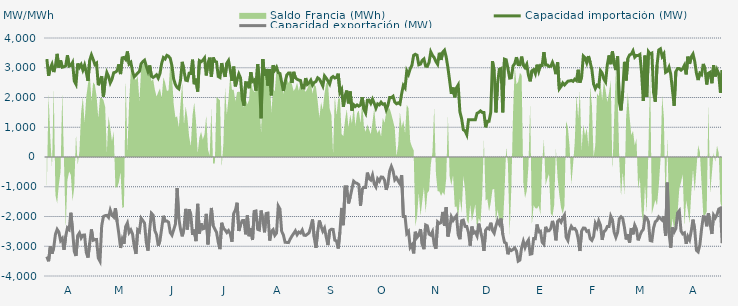
| Category | Capacidad importación (MW) | Capacidad exportación (MW) |
|---|---|---|
| 0 | 3292.833 | -3348.958 |
| 1900-01-01 | 2730.667 | -3504.917 |
| 1900-01-02 | 2985 | -3005.417 |
| 1900-01-03 | 3117.458 | -3250.417 |
| 1900-01-04 | 2855.083 | -3052.042 |
| 1900-01-05 | 3069.458 | -2602.292 |
| 1900-01-06 | 3466.417 | -2432.792 |
| 1900-01-07 | 3007.167 | -2522.875 |
| 1900-01-08 | 3244.375 | -2811.167 |
| 1900-01-09 | 3017.708 | -2737.208 |
| 1900-01-10 | 3032.833 | -3121.625 |
| 1900-01-11 | 3065.708 | -2665.083 |
| 1900-01-12 | 3418.292 | -2382.667 |
| 1900-01-13 | 3056.792 | -2438.792 |
| 1900-01-14 | 3079.167 | -1874.583 |
| 1900-01-15 | 3179.375 | -2471.917 |
| 1900-01-16 | 2552.25 | -3173.583 |
| 1900-01-17 | 2444.667 | -3327.792 |
| 1900-01-18 | 3144.958 | -2640.625 |
| 1900-01-19 | 3010.208 | -2550.208 |
| 1900-01-20 | 3107.125 | -2722.583 |
| 1900-01-21 | 2923.625 | -2627.417 |
| 1900-01-22 | 3090.583 | -2621.917 |
| 1900-01-23 | 2846.083 | -3210.25 |
| 1900-01-24 | 2560.75 | -3379.792 |
| 1900-01-25 | 3251.25 | -2896.042 |
| 1900-01-26 | 3432.333 | -2434.75 |
| 1900-01-27 | 3283.375 | -2799.542 |
| 1900-01-28 | 3108.792 | -2777.042 |
| 1900-01-29 | 3154.917 | -2772.25 |
| 1900-01-30 | 2413.25 | -3395.792 |
| 1900-01-31 | 2576 | -3503 |
| 1900-02-01 | 2711.917 | -2310.333 |
| 1900-02-02 | 2031.25 | -2002.083 |
| 1900-02-03 | 2544.667 | -1970.833 |
| 1900-02-04 | 2838.208 | -1962.5 |
| 1900-02-05 | 2706.708 | -2031.25 |
| 1900-02-06 | 2490.375 | -1785.417 |
| 1900-02-07 | 2612.792 | -1947.333 |
| 1900-02-08 | 2833 | -2014.333 |
| 1900-02-09 | 2851.583 | -1722.917 |
| 1900-02-10 | 2901.75 | -2171.25 |
| 1900-02-11 | 3113.667 | -2582.042 |
| 1900-02-12 | 2787.083 | -3055.958 |
| 1900-02-13 | 3331.625 | -2767.125 |
| 1900-02-14 | 3347 | -2920.625 |
| 1900-02-15 | 3277.833 | -2334.375 |
| 1900-02-16 | 3547.333 | -2216.875 |
| 1900-02-17 | 3127.583 | -2536.667 |
| 1900-02-18 | 3182.75 | -2450.958 |
| 1900-02-19 | 2868.792 | -2589.917 |
| 1900-02-20 | 2696.25 | -3016.542 |
| 1900-02-21 | 2758.458 | -3256.458 |
| 1900-02-22 | 2820.083 | -2452.083 |
| 1900-02-23 | 2874.792 | -2511.083 |
| 1900-02-24 | 3131.542 | -2059.125 |
| 1900-02-25 | 3205.375 | -2136.25 |
| 1900-02-26 | 3253.375 | -2224.125 |
| 1900-02-27 | 3057.042 | -2870.958 |
| 1900-02-28 | 2876.042 | -3146.333 |
| 1900-02-28 | 3076.708 | -2437.5 |
| 1900-03-01 | 2714.417 | -1890.667 |
| 1900-03-02 | 2675.25 | -1952.042 |
| 1900-03-03 | 2712.625 | -2473.333 |
| 1900-03-04 | 2762.542 | -2608.917 |
| 1900-03-05 | 2652 | -2984.583 |
| 1900-03-06 | 2806.792 | -2803.333 |
| 1900-03-07 | 3151.167 | -2401.458 |
| 1900-03-08 | 3341.792 | -1976.417 |
| 1900-03-09 | 3295.083 | -2154.25 |
| 1900-03-10 | 3415.542 | -2148.458 |
| 1900-03-11 | 3386.458 | -2191.625 |
| 1900-03-12 | 3315.833 | -2538.333 |
| 1900-03-13 | 3059.75 | -2627.417 |
| 1900-03-14 | 2619.042 | -2445.958 |
| 1900-03-15 | 2434.542 | -2258.708 |
| 1900-03-16 | 2336.958 | -1043.75 |
| 1900-03-17 | 2291.5 | -2066.667 |
| 1900-03-18 | 2591.375 | -2432.417 |
| 1900-03-19 | 3198.167 | -2666.208 |
| 1900-03-20 | 2894.833 | -2404.875 |
| 1900-03-21 | 2582.208 | -1743.542 |
| 1900-03-22 | 2566.333 | -2434.875 |
| 1900-03-23 | 2811.458 | -1757.708 |
| 1900-03-24 | 2808 | -1938.167 |
| 1900-03-25 | 3272.083 | -2618.542 |
| 1900-03-26 | 2447.208 | -2437.333 |
| 1900-03-27 | 2633.208 | -2826.667 |
| 1900-03-28 | 2202.083 | -1575 |
| 1900-03-29 | 3237.583 | -2574.625 |
| 1900-03-30 | 3201.042 | -2230.542 |
| 1900-03-31 | 3248.625 | -2416.417 |
| 1900-04-01 | 3327.583 | -2395.083 |
| 1900-04-02 | 2740.958 | -1910.417 |
| 1900-04-03 | 3160.083 | -2937.917 |
| 1900-04-04 | 3339 | -2237.833 |
| 1900-04-05 | 2697.208 | -1712.5 |
| 1900-04-06 | 3342.917 | -2305.083 |
| 1900-04-07 | 3218 | -2421.583 |
| 1900-04-08 | 3194.333 | -2530.333 |
| 1900-04-09 | 2706.458 | -2869.083 |
| 1900-04-10 | 2673 | -3096.5 |
| 1900-04-11 | 3156.5 | -2212.083 |
| 1900-04-12 | 2884.958 | -2401.708 |
| 1900-04-13 | 2692.292 | -2450.833 |
| 1900-04-14 | 3152.125 | -2539.5 |
| 1900-04-15 | 3244.042 | -2473.208 |
| 1900-04-16 | 2930.458 | -2581.292 |
| 1900-04-17 | 2559.833 | -2848.708 |
| 1900-04-18 | 3037.583 | -1901.417 |
| 1900-04-19 | 2375 | -1787.5 |
| 1900-04-20 | 2608.75 | -1537.5 |
| 1900-04-21 | 2790.667 | -2487.458 |
| 1900-04-22 | 2656.542 | -2277.167 |
| 1900-04-23 | 1950.833 | -2138.208 |
| 1900-04-24 | 1725 | -2133.333 |
| 1900-04-25 | 2500 | -2600 |
| 1900-04-26 | 2493.5 | -1964.583 |
| 1900-04-27 | 2311.125 | -2662.542 |
| 1900-04-28 | 2848.5 | -2386.333 |
| 1900-04-29 | 2541.5 | -2790.625 |
| 1900-04-30 | 2586.083 | -1829.542 |
| 1900-05-01 | 2229.167 | -1813.75 |
| 1900-05-02 | 3118.458 | -2430.875 |
| 1900-05-03 | 2560.5 | -2453.333 |
| 1900-05-04 | 1300 | -1800 |
| 1900-05-05 | 3293.208 | -2107.333 |
| 1900-05-06 | 2732.333 | -2531.667 |
| 1900-05-07 | 2958.208 | -1899.667 |
| 1900-05-08 | 2400 | -1885.417 |
| 1900-05-09 | 2949.792 | -2809.042 |
| 1900-05-10 | 2072.292 | -2500 |
| 1900-05-11 | 3083.958 | -2440.167 |
| 1900-05-12 | 2921.208 | -2632.667 |
| 1900-05-13 | 3017.667 | -2556.542 |
| 1900-05-14 | 2833.833 | -1646.083 |
| 1900-05-15 | 2807.833 | -1750 |
| 1900-05-16 | 2510.417 | -2496.792 |
| 1900-05-17 | 2220.833 | -2618.625 |
| 1900-05-18 | 2512.5 | -2867.042 |
| 1900-05-19 | 2756.375 | -2870.75 |
| 1900-05-20 | 2821.542 | -2876.667 |
| 1900-05-21 | 2821.833 | -2755.625 |
| 1900-05-22 | 2490.292 | -2656.833 |
| 1900-05-23 | 2862.667 | -2571.458 |
| 1900-05-24 | 2663.042 | -2482.25 |
| 1900-05-25 | 2613.625 | -2612.792 |
| 1900-05-26 | 2585.667 | -2523.458 |
| 1900-05-27 | 2571.292 | -2556.167 |
| 1900-05-28 | 2320.458 | -2456.542 |
| 1900-05-29 | 2316.542 | -2627.667 |
| 1900-05-30 | 2652.5 | -2635.708 |
| 1900-05-31 | 2442.625 | -2594.208 |
| 1900-06-01 | 2493.458 | -2546.125 |
| 1900-06-02 | 2582.917 | -2351.208 |
| 1900-06-03 | 2416.667 | -2100 |
| 1900-06-04 | 2504.5 | -2703.167 |
| 1900-06-05 | 2536.625 | -3052.25 |
| 1900-06-06 | 2662.208 | -2510.833 |
| 1900-06-07 | 2620.667 | -2134.75 |
| 1900-06-08 | 2511.833 | -2330.583 |
| 1900-06-09 | 2387.333 | -2494.25 |
| 1900-06-10 | 2724.583 | -2389 |
| 1900-06-11 | 2648.667 | -2691.542 |
| 1900-06-12 | 2557.292 | -2961.542 |
| 1900-06-13 | 2454.083 | -2472.25 |
| 1900-06-14 | 2661.417 | -2427.292 |
| 1900-06-15 | 2704.833 | -2434.167 |
| 1900-06-16 | 2653.75 | -2795.833 |
| 1900-06-17 | 2673.75 | -2822.875 |
| 1900-06-18 | 2800.917 | -3075.208 |
| 1900-06-19 | 2164.417 | -2510.625 |
| 1900-06-20 | 2270.833 | -1713.542 |
| 1900-06-21 | 1687.5 | -2291.667 |
| 1900-06-22 | 2066.667 | -1000 |
| 1900-06-23 | 2233.333 | -1000 |
| 1900-06-24 | 1804.167 | -1561.333 |
| 1900-06-25 | 2201.833 | -1341.667 |
| 1900-06-26 | 1556.25 | -1070.833 |
| 1900-06-27 | 1756.25 | -812.5 |
| 1900-06-28 | 1700 | -864.583 |
| 1900-06-29 | 1750 | -885.417 |
| 1900-06-30 | 1708.333 | -929.167 |
| 1900-07-01 | 1743.75 | -1636.25 |
| 1900-07-02 | 2008.083 | -1077.083 |
| 1900-07-03 | 1602.083 | -1020.833 |
| 1900-07-04 | 1479.167 | -1022.917 |
| 1900-07-05 | 1910.417 | -525 |
| 1900-07-06 | 1912.5 | -727.083 |
| 1900-07-07 | 1804.167 | -775 |
| 1900-07-08 | 1945.833 | -608.333 |
| 1900-07-09 | 1808.333 | -904.167 |
| 1900-07-10 | 1641.667 | -1006.25 |
| 1900-07-11 | 1785.417 | -735.417 |
| 1900-07-12 | 1752.083 | -812.5 |
| 1900-07-13 | 1841.667 | -675 |
| 1900-07-14 | 1772.917 | -677.083 |
| 1900-07-15 | 1788 | -777.083 |
| 1900-07-16 | 1587.5 | -1104.167 |
| 1900-07-17 | 1737.5 | -900 |
| 1900-07-18 | 1997.917 | -475 |
| 1900-07-19 | 1995.833 | -316.667 |
| 1900-07-20 | 2041.667 | -468.75 |
| 1900-07-21 | 1843.75 | -766.667 |
| 1900-07-22 | 1787.5 | -695.833 |
| 1900-07-23 | 1820.833 | -808.333 |
| 1900-07-24 | 1781.25 | -900 |
| 1900-07-25 | 2126.667 | -608.333 |
| 1900-07-26 | 2404.417 | -2000 |
| 1900-07-27 | 2323.167 | -2000 |
| 1900-07-28 | 2893.583 | -2571.5 |
| 1900-07-29 | 2778.083 | -2500.25 |
| 1900-07-30 | 2965.5 | -3038.667 |
| 1900-07-31 | 3083.64 | -2955.48 |
| 1900-08-01 | 3418.208 | -3238.958 |
| 1900-08-02 | 3452.875 | -2513.333 |
| 1900-08-03 | 3420.292 | -2703.208 |
| 1900-08-04 | 3100.083 | -2630.333 |
| 1900-08-05 | 3123.375 | -2422.458 |
| 1900-08-06 | 3242.792 | -2928.833 |
| 1900-08-07 | 3294.958 | -3098.417 |
| 1900-08-08 | 3054.042 | -2285.333 |
| 1900-08-09 | 3047.542 | -2315.25 |
| 1900-08-10 | 3179.458 | -2592.333 |
| 1900-08-11 | 3533.833 | -2627.792 |
| 1900-08-12 | 3414 | -2509.75 |
| 1900-08-13 | 3340.25 | -2944.208 |
| 1900-08-14 | 3208.208 | -3084.875 |
| 1900-08-15 | 3116.333 | -2180.292 |
| 1900-08-16 | 3502.875 | -2231.333 |
| 1900-08-17 | 3262.542 | -2201.667 |
| 1900-08-18 | 3524.167 | -1845.708 |
| 1900-08-19 | 3589.042 | -2314 |
| 1900-08-20 | 3358.375 | -1684.042 |
| 1900-08-21 | 3002 | -2672.375 |
| 1900-08-22 | 2567.583 | -2409.375 |
| 1900-08-23 | 2121 | -2013.417 |
| 1900-08-24 | 2334.5 | -2132.333 |
| 1900-08-25 | 2006.833 | -2047.042 |
| 1900-08-26 | 2325 | -1968.542 |
| 1900-08-27 | 2420.75 | -2611.292 |
| 1900-08-28 | 1517.25 | -2763 |
| 1900-08-29 | 1283.917 | -2141.667 |
| 1900-08-30 | 916.417 | -2120.833 |
| 1900-08-31 | 879.167 | -2332.417 |
| 1900-09-01 | 750 | -2334.958 |
| 1900-09-02 | 1250 | -2536 |
| 1900-09-03 | 1250 | -2982 |
| 1900-09-04 | 1250 | -2338.583 |
| 1900-09-05 | 1250 | -2558.333 |
| 1900-09-06 | 1250 | -2526.375 |
| 1900-09-07 | 1470.833 | -2652.25 |
| 1900-09-08 | 1500 | -2239.292 |
| 1900-09-09 | 1550 | -2486.75 |
| 1900-09-10 | 1500 | -2733.5 |
| 1900-09-11 | 1500 | -3155.125 |
| 1900-09-12 | 1000 | -2458.542 |
| 1900-09-13 | 1200 | -2385.25 |
| 1900-09-14 | 1200 | -2419 |
| 1900-09-15 | 1500 | -2208.75 |
| 1900-09-16 | 3221.708 | -2468.625 |
| 1900-09-17 | 2881.375 | -2561.25 |
| 1900-09-18 | 1500 | -2320.833 |
| 1900-09-19 | 2479.75 | -2136.875 |
| 1900-09-20 | 2947.875 | -2253.917 |
| 1900-09-21 | 2974.833 | -2068.75 |
| 1900-09-22 | 1500 | -2595.083 |
| 1900-09-23 | 3289.208 | -2867.583 |
| 1900-09-24 | 3267.875 | -2898.625 |
| 1900-09-25 | 2979.083 | -3270.083 |
| 1900-09-26 | 2652.375 | -3097.333 |
| 1900-09-27 | 2663.208 | -3144.542 |
| 1900-09-28 | 3058.292 | -3107.917 |
| 1900-09-29 | 3141.958 | -3054.292 |
| 1900-09-30 | 3354.667 | -3163.833 |
| 1900-10-01 | 3106.083 | -3500.875 |
| 1900-10-02 | 3099.042 | -3464.417 |
| 1900-10-03 | 3374.208 | -3046.25 |
| 1900-10-04 | 3081.083 | -2836.417 |
| 1900-10-05 | 3002 | -3040.417 |
| 1900-10-06 | 3113.875 | -2884.417 |
| 1900-10-07 | 2746.792 | -2789.333 |
| 1900-10-08 | 2544 | -3266.167 |
| 1900-10-09 | 2896.458 | -3250.667 |
| 1900-10-10 | 2937 | -2740.375 |
| 1900-10-11 | 2803.458 | -2745 |
| 1900-10-12 | 3104.125 | -2267.833 |
| 1900-10-13 | 2884.333 | -2514.583 |
| 1900-10-14 | 3081.042 | -2493.458 |
| 1900-10-15 | 3079.083 | -2866 |
| 1900-10-16 | 3524.292 | -2932.083 |
| 1900-10-17 | 3096.5 | -2347.083 |
| 1900-10-18 | 3096.5 | -2484.875 |
| 1900-10-19 | 3044.417 | -2478.583 |
| 1900-10-20 | 3048.167 | -2403.5 |
| 1900-10-21 | 3181.083 | -2147.542 |
| 1900-10-22 | 3030.708 | -2365.833 |
| 1900-10-23 | 2784.5 | -2801.333 |
| 1900-10-24 | 3182.417 | -2165.083 |
| 1900-10-25 | 2292.583 | -2110.5 |
| 1900-10-26 | 2370.25 | -2192.75 |
| 1900-10-27 | 2487.208 | -2051.417 |
| 1900-10-28 | 2421.292 | -1952.083 |
| 1900-10-29 | 2482.917 | -2699.375 |
| 1900-10-30 | 2548.458 | -2805.375 |
| 1900-10-31 | 2554.458 | -2484.042 |
| 1900-11-01 | 2574.083 | -2331.417 |
| 1900-11-02 | 2544.458 | -2417.833 |
| 1900-11-03 | 2615.833 | -2403.25 |
| 1900-11-04 | 2568.917 | -2488.625 |
| 1900-11-05 | 2932.208 | -2748.875 |
| 1900-11-06 | 2500.875 | -3160.125 |
| 1900-11-07 | 2689.458 | -2491.667 |
| 1900-11-08 | 3392.292 | -2386.5 |
| 1900-11-09 | 3335.083 | -2392.75 |
| 1900-11-10 | 3167.5 | -2500.5 |
| 1900-11-11 | 3390.625 | -2475.917 |
| 1900-11-12 | 3180.958 | -2741.75 |
| 1900-11-13 | 2936.5 | -2801.625 |
| 1900-11-14 | 2452.792 | -2674.667 |
| 1900-11-15 | 2300.208 | -2235.25 |
| 1900-11-16 | 2411.792 | -2365.167 |
| 1900-11-17 | 2366.75 | -2147.917 |
| 1900-11-18 | 2902.042 | -2292.875 |
| 1900-11-19 | 2822.25 | -2784.375 |
| 1900-11-20 | 2619.333 | -2505.792 |
| 1900-11-21 | 2523.292 | -2462.542 |
| 1900-11-22 | 3101.75 | -2337.5 |
| 1900-11-23 | 3414.042 | -2335.5 |
| 1900-11-24 | 3119.417 | -1987.458 |
| 1900-11-25 | 3547.333 | -2114.583 |
| 1900-11-26 | 3135.708 | -2530.042 |
| 1900-11-27 | 2921.125 | -2699.333 |
| 1900-11-28 | 3380.917 | -2535.75 |
| 1900-11-29 | 1842.042 | -2078.542 |
| 1900-11-30 | 1566.833 | -2010.417 |
| 1900-12-01 | 2214.542 | -2066.667 |
| 1900-12-02 | 3198.583 | -2370 |
| 1900-12-03 | 2574 | -2772.958 |
| 1900-12-04 | 3310.583 | -2592.083 |
| 1900-12-05 | 3430.75 | -2875.542 |
| 1900-12-06 | 3458.333 | -2387.75 |
| 1900-12-07 | 3568.125 | -2599.208 |
| 1900-12-08 | 3355.708 | -2294.333 |
| 1900-12-09 | 3414.333 | -2427 |
| 1900-12-10 | 3410.542 | -2802.125 |
| 1900-12-11 | 3447.375 | -2640.958 |
| 1900-12-12 | 2831.208 | -2506.667 |
| 1900-12-13 | 1881.583 | -2434.25 |
| 1900-12-14 | 3406.708 | -2011.583 |
| 1900-12-15 | 2022.5 | -2050 |
| 1900-12-16 | 3540.875 | -2176.417 |
| 1900-12-17 | 3466.542 | -2807.167 |
| 1900-12-18 | 3493.375 | -2823.167 |
| 1900-12-19 | 2166.833 | -2382.125 |
| 1900-12-20 | 1859.958 | -2177.167 |
| 1900-12-21 | 3077.875 | -2132.833 |
| 1900-12-22 | 3595.75 | -2015.417 |
| 1900-12-23 | 3634.375 | -2069.417 |
| 1900-12-24 | 3379.833 | -2125 |
| 1900-12-25 | 3470.304 | -1991.957 |
| 1900-12-26 | 2844 | -2641.708 |
| 1900-12-27 | 2880.625 | -862.5 |
| 1900-12-28 | 3017.208 | -2558.208 |
| 1900-12-29 | 2787.708 | -3047.042 |
| 1900-12-30 | 2256.625 | -2365.667 |
| 1900-12-31 | 1722.917 | -2515.917 |
| 1901-01-01 | 2869 | -2405.667 |
| 1901-01-02 | 2973.167 | -1879.167 |
| 1901-01-03 | 2971 | -1806.25 |
| 1901-01-04 | 2919.208 | -2484.833 |
| 1901-01-05 | 2973.125 | -2583.917 |
| 1901-01-06 | 3083.25 | -2551.375 |
| 1901-01-07 | 2777.875 | -2917.292 |
| 1901-01-08 | 3371.833 | -2672.292 |
| 1901-01-09 | 3131 | -2785.25 |
| 1901-01-10 | 3368.375 | -2480.958 |
| 1901-01-11 | 3462.292 | -2105.333 |
| 1901-01-12 | 3215.917 | -2442.958 |
| 1901-01-13 | 2817.875 | -3136.917 |
| 1901-01-14 | 2586 | -3188.792 |
| 1901-01-15 | 2815 | -2954.042 |
| 1901-01-16 | 2767 | -2418.75 |
| 1901-01-17 | 3129.208 | -2005 |
| 1901-01-18 | 2953.792 | -2013.417 |
| 1901-01-19 | 2437.083 | -2329.833 |
| 1901-01-20 | 2815.958 | -1889.333 |
| 1901-01-21 | 2849.708 | -2257.667 |
| 1901-01-22 | 2479.208 | -2586.833 |
| 1901-01-23 | 3084.333 | -1954.5 |
| 1901-01-24 | 2707.042 | -2046.583 |
| 1901-01-25 | 2933.542 | -1941.667 |
| 1901-01-26 | 2795.917 | -1750 |
| 1901-01-27 | 2158.042 | -1718.75 |
| 1901-01-28 | 2918.875 | -2898.083 |